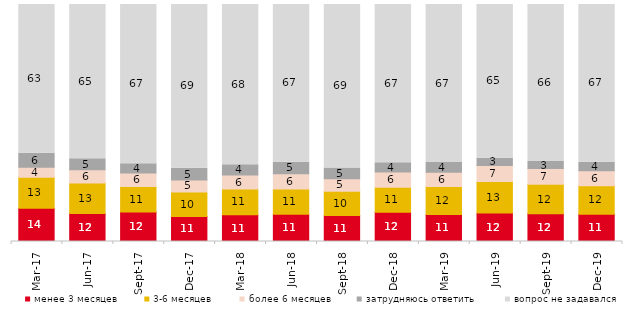
| Category | менее 3 месяцев | 3-6 месяцев | более 6 месяцев | затрудняюсь ответить | вопрос не задавался |
|---|---|---|---|---|---|
| 2017-03-01 | 14.05 | 13.05 | 4.25 | 5.85 | 62.8 |
| 2017-06-01 | 11.8 | 12.85 | 5.65 | 4.65 | 65.05 |
| 2017-09-01 | 12.45 | 10.75 | 5.7 | 3.9 | 67.2 |
| 2017-12-01 | 10.55 | 10.3 | 5.15 | 4.95 | 69.05 |
| 2018-03-01 | 11.3 | 10.8 | 6 | 4.25 | 67.65 |
| 2018-06-01 | 11.45 | 10.75 | 6.4 | 4.85 | 66.55 |
| 2018-09-01 | 10.95 | 10.3 | 5.2 | 4.55 | 69 |
| 2018-12-01 | 12.3 | 10.6 | 6.4 | 3.95 | 66.75 |
| 2019-03-01 | 11.437 | 11.735 | 6.067 | 4.078 | 66.683 |
| 2019-06-01 | 12.07 | 13.217 | 6.733 | 3.142 | 64.838 |
| 2019-09-01 | 11.683 | 12.426 | 6.683 | 2.921 | 66.287 |
| 2019-12-01 | 11.485 | 12.079 | 6.238 | 3.614 | 66.584 |